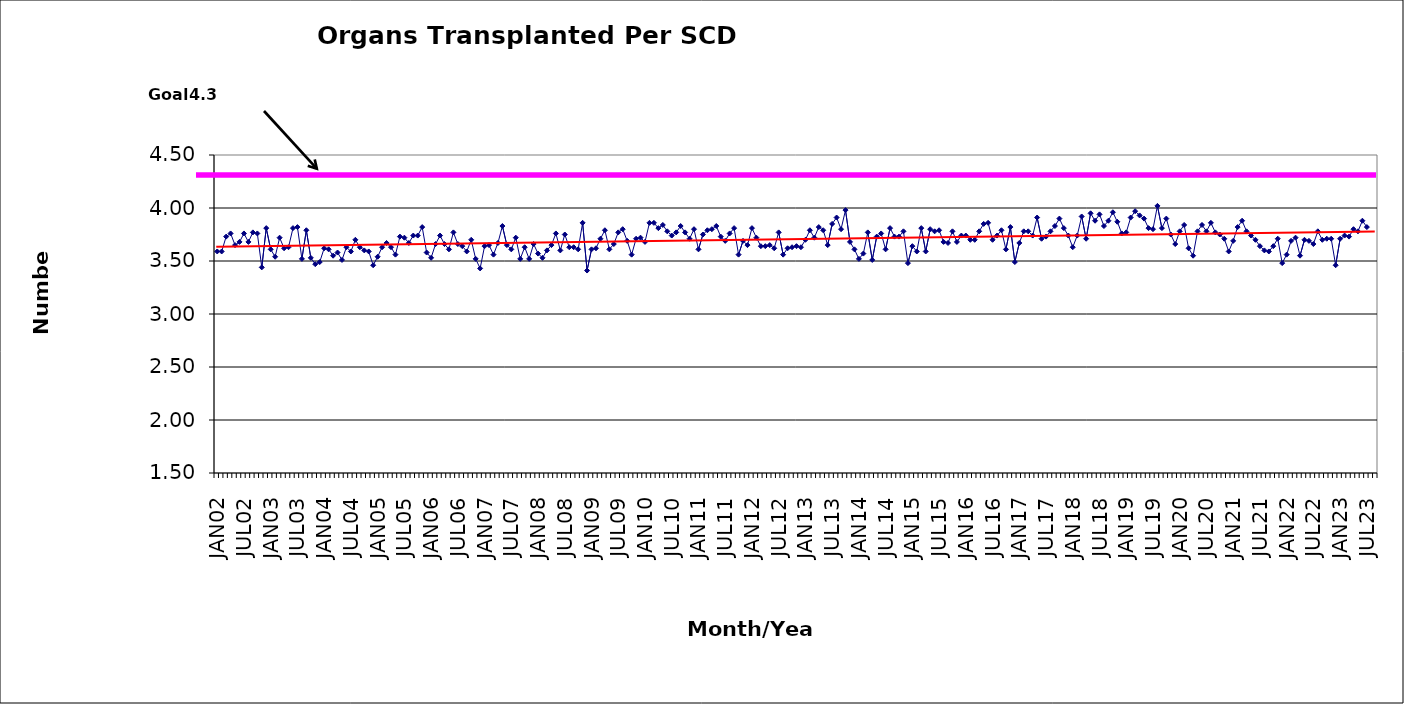
| Category | Series 0 |
|---|---|
| JAN02 | 3.59 |
| FEB02 | 3.59 |
| MAR02 | 3.73 |
| APR02 | 3.76 |
| MAY02 | 3.65 |
| JUN02 | 3.68 |
| JUL02 | 3.76 |
| AUG02 | 3.68 |
| SEP02 | 3.77 |
| OCT02 | 3.76 |
| NOV02 | 3.44 |
| DEC02 | 3.81 |
| JAN03 | 3.61 |
| FEB03 | 3.54 |
| MAR03 | 3.72 |
| APR03 | 3.62 |
| MAY03 | 3.63 |
| JUN03 | 3.81 |
| JUL03 | 3.82 |
| AUG03 | 3.52 |
| SEP03 | 3.79 |
| OCT03 | 3.53 |
| NOV03 | 3.47 |
| DEC03 | 3.49 |
| JAN04 | 3.62 |
| FEB04 | 3.61 |
| MAR04 | 3.55 |
| APR04 | 3.58 |
| MAY04 | 3.51 |
| JUN04 | 3.63 |
| JUL04 | 3.59 |
| AUG04 | 3.7 |
| SEP04 | 3.63 |
| OCT04 | 3.6 |
| NOV04 | 3.59 |
| DEC04 | 3.46 |
| JAN05 | 3.54 |
| FEB05 | 3.63 |
| MAR05 | 3.67 |
| APR05 | 3.63 |
| MAY05 | 3.56 |
| JUN05 | 3.73 |
| JUL05 | 3.72 |
| AUG05 | 3.67 |
| SEP05 | 3.74 |
| OCT05 | 3.74 |
| NOV05 | 3.82 |
| DEC05 | 3.58 |
| JAN06 | 3.53 |
| FEB06 | 3.66 |
| MAR06 | 3.74 |
| APR06 | 3.66 |
| MAY06 | 3.61 |
| JUN06 | 3.77 |
| JUL06 | 3.66 |
| AUG06 | 3.64 |
| SEP06 | 3.59 |
| OCT06 | 3.7 |
| NOV06 | 3.52 |
| DEC06 | 3.43 |
| JAN07 | 3.64 |
| FEB07 | 3.65 |
| MAR07 | 3.56 |
| APR07 | 3.67 |
| MAY07 | 3.83 |
| JUN07 | 3.65 |
| JUL07 | 3.61 |
| AUG07 | 3.72 |
| SEP07 | 3.52 |
| OCT07 | 3.63 |
| NOV07 | 3.52 |
| DEC07 | 3.66 |
| JAN08 | 3.57 |
| FEB08 | 3.53 |
| MAR08 | 3.6 |
| APR08 | 3.65 |
| MAY08 | 3.76 |
| JUN08 | 3.6 |
| JUL08 | 3.75 |
| AUG08 | 3.63 |
| SEP08 | 3.63 |
| OCT08 | 3.61 |
| NOV08 | 3.86 |
| DEC08 | 3.41 |
| JAN09 | 3.61 |
| FEB09 | 3.62 |
| MAR09 | 3.71 |
| APR09 | 3.79 |
| MAY09 | 3.61 |
| JUN09 | 3.66 |
| JUL09 | 3.77 |
| AUG09 | 3.8 |
| SEP09 | 3.69 |
| OCT09 | 3.56 |
| NOV09 | 3.71 |
| DEC09 | 3.72 |
| JAN10 | 3.68 |
| FEB10 | 3.86 |
| MAR10 | 3.86 |
| APR10 | 3.81 |
| MAY10 | 3.84 |
| JUN10 | 3.78 |
| JUL10 | 3.74 |
| AUG10 | 3.77 |
| SEP10 | 3.83 |
| OCT10 | 3.77 |
| NOV10 | 3.71 |
| DEC10 | 3.8 |
| JAN11 | 3.61 |
| FEB11 | 3.75 |
| MAR11 | 3.79 |
| APR11 | 3.8 |
| MAY11 | 3.83 |
| JUN11 | 3.73 |
| JUL11 | 3.69 |
| AUG11 | 3.76 |
| SEP11 | 3.81 |
| OCT11 | 3.56 |
| NOV11 | 3.69 |
| DEC11 | 3.65 |
| JAN12 | 3.81 |
| FEB12 | 3.72 |
| MAR12 | 3.64 |
| APR12 | 3.64 |
| MAY12 | 3.65 |
| JUN12 | 3.62 |
| JUL12 | 3.77 |
| AUG12 | 3.56 |
| SEP12 | 3.62 |
| OCT12 | 3.63 |
| NOV12 | 3.64 |
| DEC12 | 3.63 |
| JAN13 | 3.7 |
| FEB13 | 3.79 |
| MAR13 | 3.72 |
| APR13 | 3.82 |
| MAY13 | 3.79 |
| JUN13 | 3.65 |
| JUL13 | 3.85 |
| AUG13 | 3.91 |
| SEP13 | 3.8 |
| OCT13 | 3.98 |
| NOV13 | 3.68 |
| DEC13 | 3.61 |
| JAN14 | 3.52 |
| FEB14 | 3.57 |
| MAR14 | 3.77 |
| APR14 | 3.51 |
| MAY14 | 3.73 |
| JUN14 | 3.76 |
| JUL14 | 3.61 |
| AUG14 | 3.81 |
| SEP14 | 3.73 |
| OCT14 | 3.73 |
| NOV14 | 3.78 |
| DEC14 | 3.48 |
| JAN15 | 3.64 |
| FEB15 | 3.59 |
| MAR15 | 3.81 |
| APR15 | 3.59 |
| MAY15 | 3.8 |
| JUN15 | 3.78 |
| JUL15 | 3.79 |
| AUG15 | 3.68 |
| SEP15 | 3.67 |
| OCT15 | 3.78 |
| NOV15 | 3.68 |
| DEC15 | 3.74 |
| JAN16 | 3.74 |
| FEB16 | 3.7 |
| MAR16 | 3.7 |
| APR16 | 3.78 |
| MAY16 | 3.85 |
| JUN16 | 3.86 |
| JUL16 | 3.7 |
| AUG16 | 3.74 |
| SEP16 | 3.79 |
| OCT16 | 3.61 |
| NOV16 | 3.82 |
| DEC16 | 3.49 |
| JAN17 | 3.67 |
| FEB17 | 3.78 |
| MAR17 | 3.78 |
| APR17 | 3.74 |
| MAY17 | 3.91 |
| JUN17 | 3.71 |
| JUL17 | 3.73 |
| AUG17 | 3.78 |
| SEP17 | 3.83 |
| OCT17 | 3.9 |
| NOV17 | 3.81 |
| DEC17 | 3.74 |
| JAN18 | 3.63 |
| FEB18 | 3.74 |
| MAR18 | 3.92 |
| APR18 | 3.71 |
| MAY18 | 3.95 |
| JUN18 | 3.88 |
| JUL18 | 3.94 |
| AUG18 | 3.83 |
| SEP18 | 3.88 |
| OCT18 | 3.96 |
| NOV18 | 3.87 |
| DEC18 | 3.76 |
| JAN19 | 3.77 |
| FEB19 | 3.91 |
| MAR19 | 3.97 |
| APR19 | 3.93 |
| MAY19 | 3.9 |
| JUN19 | 3.81 |
| JUL19 | 3.8 |
| AUG19 | 4.02 |
| SEP19 | 3.81 |
| OCT19 | 3.9 |
| NOV19 | 3.75 |
| DEC19 | 3.66 |
| JAN20 | 3.78 |
| FEB20 | 3.84 |
| MAR20 | 3.62 |
| APR20 | 3.55 |
| MAY20 | 3.78 |
| JUN20 | 3.84 |
| JUL20 | 3.78 |
| AUG20 | 3.86 |
| SEP20 | 3.77 |
| OCT20 | 3.75 |
| NOV20 | 3.71 |
| DEC20 | 3.59 |
| JAN21 | 3.69 |
| FEB21 | 3.82 |
| MAR21 | 3.88 |
| APR21 | 3.78 |
| MAY21 | 3.74 |
| JUN21 | 3.7 |
| JUL21 | 3.64 |
| AUG21 | 3.6 |
| SEP21 | 3.59 |
| OCT21 | 3.64 |
| NOV21 | 3.71 |
| DEC21 | 3.48 |
| JAN22 | 3.56 |
| FEB22 | 3.69 |
| MAR22 | 3.72 |
| APR22 | 3.55 |
| MAY22 | 3.7 |
| JUN22 | 3.69 |
| JUL22 | 3.66 |
| AUG22 | 3.78 |
| SEP22 | 3.7 |
| OCT22 | 3.71 |
| NOV22 | 3.71 |
| DEC22 | 3.46 |
| JAN23 | 3.71 |
| FEB23 | 3.74 |
| MAR23 | 3.73 |
| APR23 | 3.8 |
| MAY23 | 3.78 |
| JUN23 | 3.88 |
| JUL23 | 3.82 |